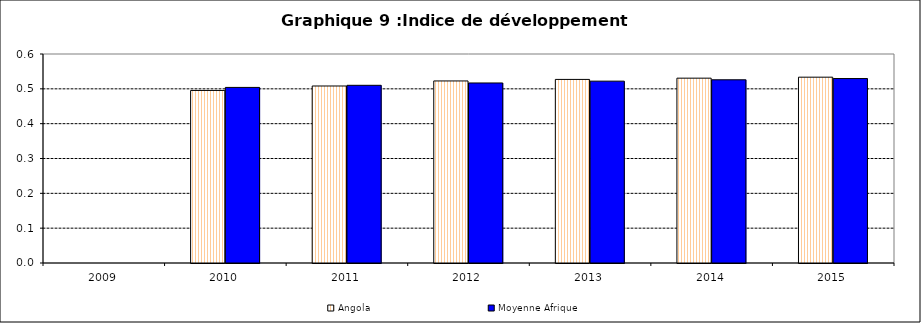
| Category | Angola | Moyenne Afrique |
|---|---|---|
| 2009.0 | 0 | 0 |
| 2010.0 | 0.495 | 0.504 |
| 2011.0 | 0.508 | 0.51 |
| 2012.0 | 0.523 | 0.517 |
| 2013.0 | 0.527 | 0.522 |
| 2014.0 | 0.531 | 0.526 |
| 2015.0 | 0.533 | 0.53 |